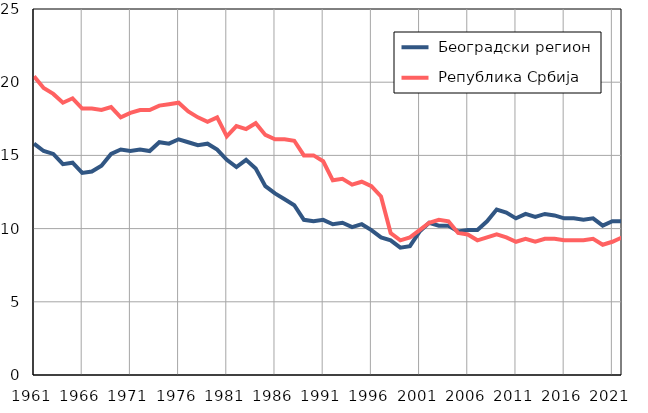
| Category |  Београдски регион |  Република Србија |
|---|---|---|
| 1961.0 | 15.8 | 20.4 |
| 1962.0 | 15.3 | 19.6 |
| 1963.0 | 15.1 | 19.2 |
| 1964.0 | 14.4 | 18.6 |
| 1965.0 | 14.5 | 18.9 |
| 1966.0 | 13.8 | 18.2 |
| 1967.0 | 13.9 | 18.2 |
| 1968.0 | 14.3 | 18.1 |
| 1969.0 | 15.1 | 18.3 |
| 1970.0 | 15.4 | 17.6 |
| 1971.0 | 15.3 | 17.9 |
| 1972.0 | 15.4 | 18.1 |
| 1973.0 | 15.3 | 18.1 |
| 1974.0 | 15.9 | 18.4 |
| 1975.0 | 15.8 | 18.5 |
| 1976.0 | 16.1 | 18.6 |
| 1977.0 | 15.9 | 18 |
| 1978.0 | 15.7 | 17.6 |
| 1979.0 | 15.8 | 17.3 |
| 1980.0 | 15.4 | 17.6 |
| 1981.0 | 14.7 | 16.3 |
| 1982.0 | 14.2 | 17 |
| 1983.0 | 14.7 | 16.8 |
| 1984.0 | 14.1 | 17.2 |
| 1985.0 | 12.9 | 16.4 |
| 1986.0 | 12.4 | 16.1 |
| 1987.0 | 12 | 16.1 |
| 1988.0 | 11.6 | 16 |
| 1989.0 | 10.6 | 15 |
| 1990.0 | 10.5 | 15 |
| 1991.0 | 10.6 | 14.6 |
| 1992.0 | 10.3 | 13.3 |
| 1993.0 | 10.4 | 13.4 |
| 1994.0 | 10.1 | 13 |
| 1995.0 | 10.3 | 13.2 |
| 1996.0 | 9.9 | 12.9 |
| 1997.0 | 9.4 | 12.2 |
| 1998.0 | 9.2 | 9.7 |
| 1999.0 | 8.7 | 9.2 |
| 2000.0 | 8.8 | 9.4 |
| 2001.0 | 9.8 | 9.9 |
| 2002.0 | 10.4 | 10.4 |
| 2003.0 | 10.2 | 10.6 |
| 2004.0 | 10.2 | 10.5 |
| 2005.0 | 9.8 | 9.7 |
| 2006.0 | 9.9 | 9.6 |
| 2007.0 | 9.9 | 9.2 |
| 2008.0 | 10.5 | 9.4 |
| 2009.0 | 11.3 | 9.6 |
| 2010.0 | 11.1 | 9.4 |
| 2011.0 | 10.7 | 9.1 |
| 2012.0 | 11 | 9.3 |
| 2013.0 | 10.8 | 9.1 |
| 2014.0 | 11 | 9.3 |
| 2015.0 | 10.9 | 9.3 |
| 2016.0 | 10.7 | 9.2 |
| 2017.0 | 10.7 | 9.2 |
| 2018.0 | 10.6 | 9.2 |
| 2019.0 | 10.7 | 9.3 |
| 2020.0 | 10.2 | 8.9 |
| 2021.0 | 10.5 | 9.1 |
| 2022.0 | 10.5 | 9.4 |